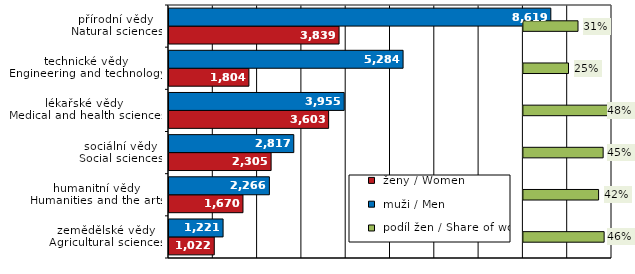
| Category |  ženy / Women |  muži / Men |
|---|---|---|
| zemědělské vědy
Agricultural sciences | 1022 | 1221 |
| humanitní vědy
Humanities and the arts | 1670 | 2266 |
| sociální vědy
Social sciences | 2305 | 2817 |
| lékařské vědy 
Medical and health sciences | 3603 | 3955 |
| technické vědy
Engineering and technology | 1804 | 5284 |
| přírodní vědy 
Natural sciences | 3839 | 8619 |